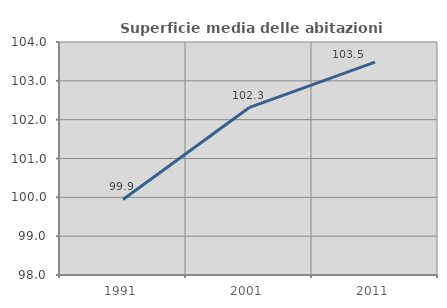
| Category | Superficie media delle abitazioni occupate |
|---|---|
| 1991.0 | 99.946 |
| 2001.0 | 102.309 |
| 2011.0 | 103.484 |